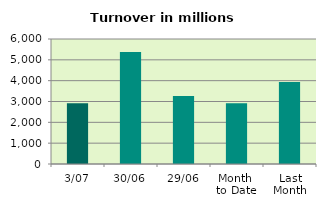
| Category | Series 0 |
|---|---|
| 3/07 | 2921.041 |
| 30/06 | 5370.304 |
| 29/06 | 3258.87 |
| Month 
to Date | 2921.041 |
| Last
Month | 3940.311 |